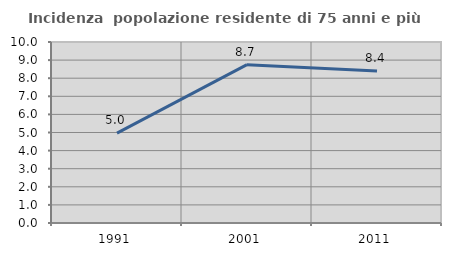
| Category | Incidenza  popolazione residente di 75 anni e più |
|---|---|
| 1991.0 | 4.966 |
| 2001.0 | 8.747 |
| 2011.0 | 8.398 |